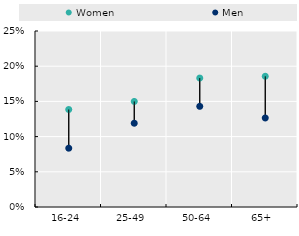
| Category | Women | Men |
|---|---|---|
| 16-24 | 0.138 | 0.084 |
| 25-49 | 0.15 | 0.119 |
| 50-64 | 0.183 | 0.143 |
| 65+ | 0.186 | 0.126 |